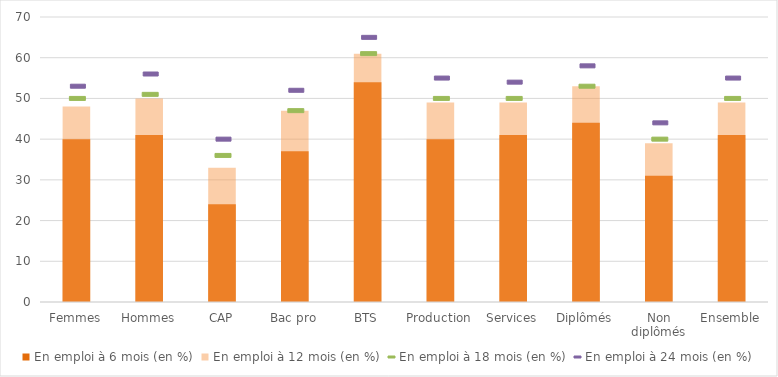
| Category | En emploi à 6 mois (en %) | En emploi à 12 mois (en %) |
|---|---|---|
| Femmes | 40 | 48 |
| Hommes | 41 | 50 |
| CAP | 24 | 33 |
| Bac pro | 37 | 47 |
| BTS | 54 | 61 |
| Production | 40 | 49 |
| Services | 41 | 49 |
| Diplômés | 44 | 53 |
| Non diplômés | 31 | 39 |
| Ensemble | 41 | 49 |